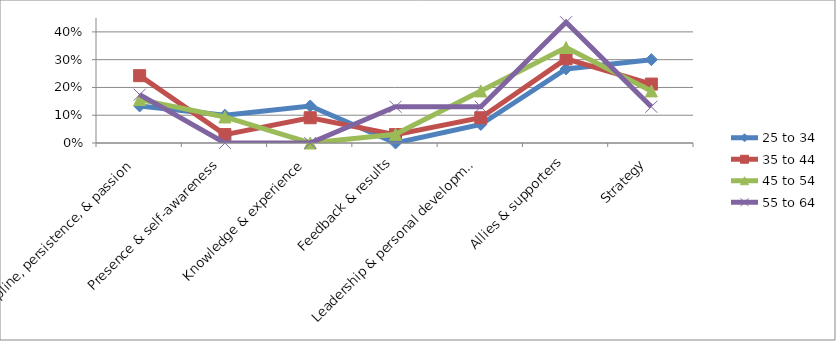
| Category | 25 to 34 | 35 to 44 | 45 to 54 | 55 to 64 |
|---|---|---|---|---|
| Discipline, persistence, & passion | 0.133 | 0.242 | 0.156 | 0.174 |
| Presence & self-awareness | 0.1 | 0.03 | 0.094 | 0 |
| Knowledge & experience | 0.133 | 0.091 | 0 | 0 |
| Feedback & results | 0 | 0.03 | 0.031 | 0.13 |
| Leadership & personal development | 0.067 | 0.091 | 0.188 | 0.13 |
| Allies & supporters | 0.267 | 0.303 | 0.344 | 0.435 |
| Strategy | 0.3 | 0.212 | 0.188 | 0.13 |